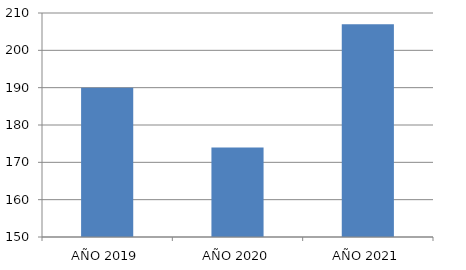
| Category | Series 0 |
|---|---|
| AÑO 2019 | 190 |
| AÑO 2020 | 174 |
| AÑO 2021 | 207 |